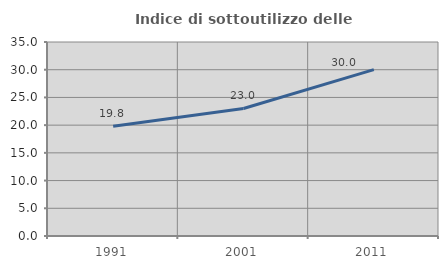
| Category | Indice di sottoutilizzo delle abitazioni  |
|---|---|
| 1991.0 | 19.788 |
| 2001.0 | 23.013 |
| 2011.0 | 30.011 |